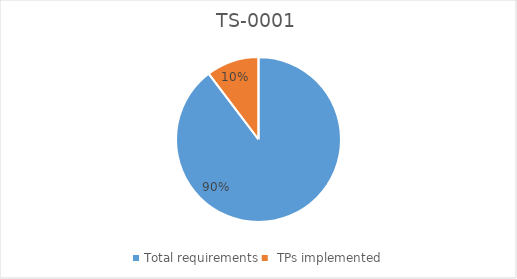
| Category | TS-0001 |
|---|---|
| Total requirements | 999 |
|  TPs implemented | 115 |